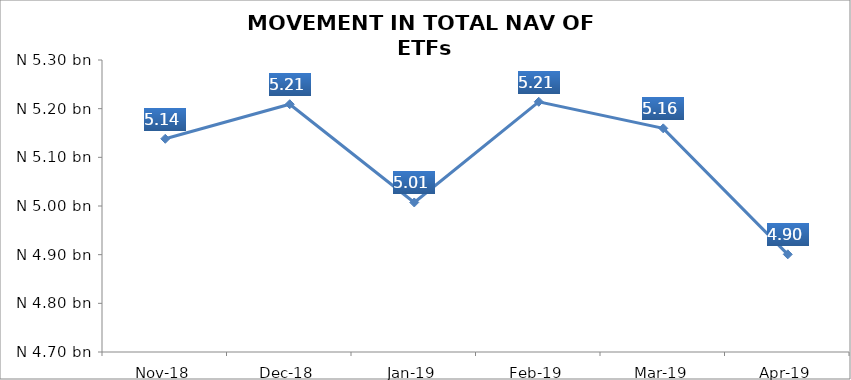
| Category | Series 0 |
|---|---|
| 2018-11-01 | 5138140059.08 |
| 2018-12-01 | 5209127720.29 |
| 2019-01-01 | 5007243642.12 |
| 2019-02-01 | 5214161600.39 |
| 2019-03-01 | 5159546061.43 |
| 2019-04-01 | 4900686319.26 |